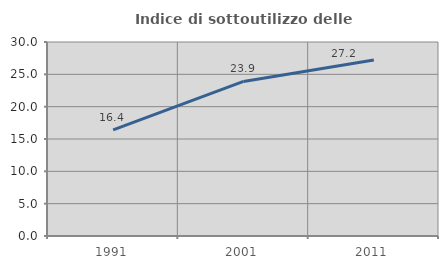
| Category | Indice di sottoutilizzo delle abitazioni  |
|---|---|
| 1991.0 | 16.417 |
| 2001.0 | 23.898 |
| 2011.0 | 27.208 |